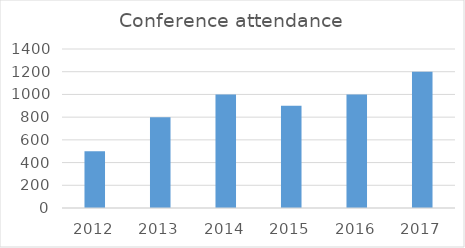
| Category | Conference attendance |
|---|---|
| 2012.0 | 500 |
| 2013.0 | 800 |
| 2014.0 | 1000 |
| 2015.0 | 900 |
| 2016.0 | 1000 |
| 2017.0 | 1200 |